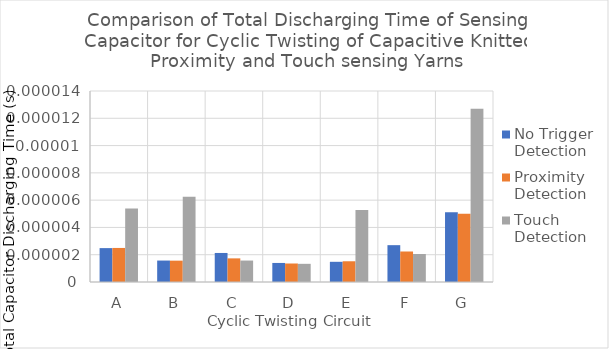
| Category | No Trigger Detection | Proximity Detection | Touch Detection |
|---|---|---|---|
| A | 0 | 0 | 0 |
| B | 0 | 0 | 0 |
| C | 0 | 0 | 0 |
| D | 0 | 0 | 0 |
| E | 0 | 0 | 0 |
| F | 0 | 0 | 0 |
| G | 0 | 0 | 0 |